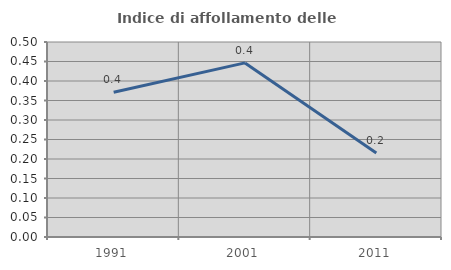
| Category | Indice di affollamento delle abitazioni  |
|---|---|
| 1991.0 | 0.371 |
| 2001.0 | 0.446 |
| 2011.0 | 0.216 |